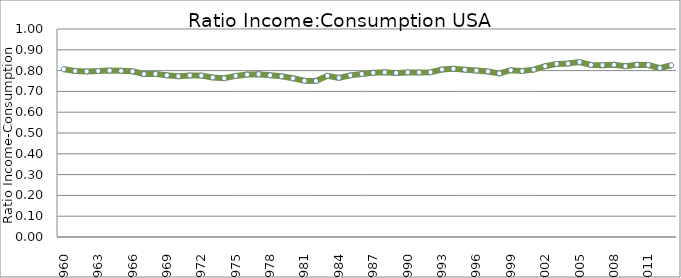
| Category | Series 0 |
|---|---|
| 1960.0 | 0.807 |
| 1961.0 | 0.798 |
| 1962.0 | 0.796 |
| 1963.0 | 0.798 |
| 1964.0 | 0.8 |
| 1965.0 | 0.799 |
| 1966.0 | 0.796 |
| 1967.0 | 0.784 |
| 1968.0 | 0.784 |
| 1969.0 | 0.777 |
| 1970.0 | 0.773 |
| 1971.0 | 0.777 |
| 1972.0 | 0.776 |
| 1973.0 | 0.767 |
| 1974.0 | 0.763 |
| 1975.0 | 0.774 |
| 1976.0 | 0.781 |
| 1977.0 | 0.783 |
| 1978.0 | 0.777 |
| 1979.0 | 0.773 |
| 1980.0 | 0.763 |
| 1981.0 | 0.751 |
| 1982.0 | 0.75 |
| 1983.0 | 0.775 |
| 1984.0 | 0.765 |
| 1985.0 | 0.777 |
| 1986.0 | 0.784 |
| 1987.0 | 0.789 |
| 1988.0 | 0.792 |
| 1989.0 | 0.789 |
| 1990.0 | 0.791 |
| 1991.0 | 0.791 |
| 1992.0 | 0.792 |
| 1993.0 | 0.805 |
| 1994.0 | 0.809 |
| 1995.0 | 0.804 |
| 1996.0 | 0.8 |
| 1997.0 | 0.796 |
| 1998.0 | 0.786 |
| 1999.0 | 0.802 |
| 2000.0 | 0.798 |
| 2001.0 | 0.805 |
| 2002.0 | 0.821 |
| 2003.0 | 0.832 |
| 2004.0 | 0.834 |
| 2005.0 | 0.841 |
| 2006.0 | 0.827 |
| 2007.0 | 0.826 |
| 2008.0 | 0.828 |
| 2009.0 | 0.821 |
| 2010.0 | 0.828 |
| 2011.0 | 0.827 |
| 2012.0 | 0.812 |
| 2013.0 | 0.826 |